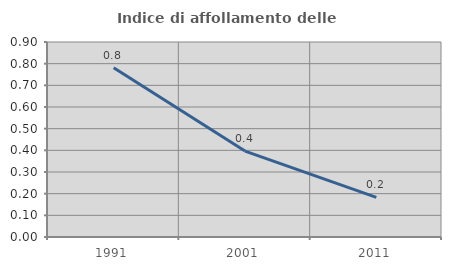
| Category | Indice di affollamento delle abitazioni  |
|---|---|
| 1991.0 | 0.781 |
| 2001.0 | 0.397 |
| 2011.0 | 0.183 |